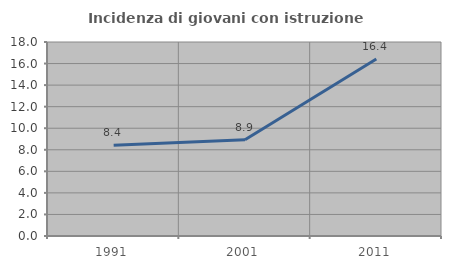
| Category | Incidenza di giovani con istruzione universitaria |
|---|---|
| 1991.0 | 8.424 |
| 2001.0 | 8.929 |
| 2011.0 | 16.415 |